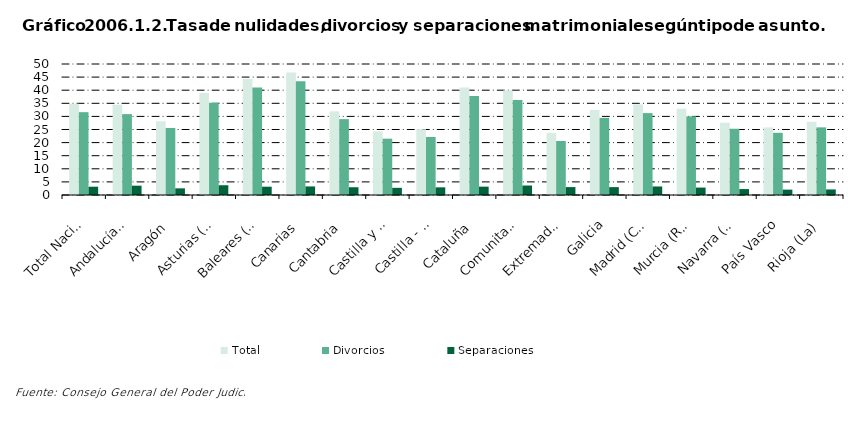
| Category | Total | Divorcios | Separaciones |
|---|---|---|---|
| Total Nacional | 34.809 | 31.608 | 3.167 |
| Andalucía(1) | 34.469 | 30.876 | 3.557 |
| Aragón | 28.142 | 25.59 | 2.536 |
| Asturias (Principado de) | 38.899 | 35.166 | 3.724 |
| Baleares (Illes) | 44.253 | 40.996 | 3.167 |
| Canarias | 46.782 | 43.461 | 3.267 |
| Cantabria | 31.932 | 28.957 | 2.957 |
| Castilla y León | 24.304 | 21.498 | 2.739 |
| Castilla - La Mancha | 25.105 | 22.155 | 2.924 |
| Cataluña | 41.043 | 37.831 | 3.186 |
| Comunitat Valenciana | 39.909 | 36.231 | 3.62 |
| Extremadura | 23.629 | 20.61 | 3.019 |
| Galicia | 32.462 | 29.441 | 3.003 |
| Madrid (Comunidad de) | 34.538 | 31.257 | 3.252 |
| Murcia (Región de) | 32.89 | 30.037 | 2.831 |
| Navarra (Comunidad Foral de) | 27.581 | 25.288 | 2.26 |
| País Vasco | 25.8 | 23.734 | 2.048 |
| Rioja (La) | 27.939 | 25.818 | 2.122 |